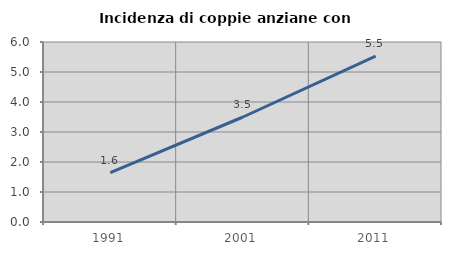
| Category | Incidenza di coppie anziane con figli |
|---|---|
| 1991.0 | 1.644 |
| 2001.0 | 3.5 |
| 2011.0 | 5.526 |